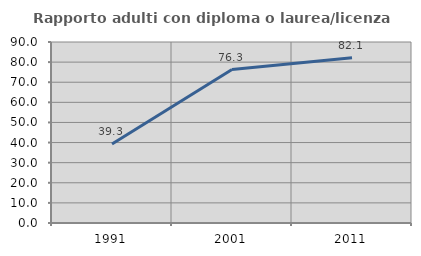
| Category | Rapporto adulti con diploma o laurea/licenza media  |
|---|---|
| 1991.0 | 39.316 |
| 2001.0 | 76.307 |
| 2011.0 | 82.128 |